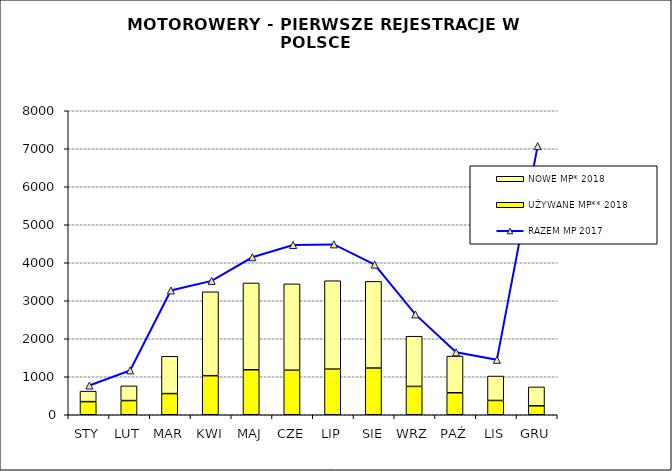
| Category | UŻYWANE MP** 2018 | NOWE MP* 2018 |
|---|---|---|
| STY | 345 | 277 |
| LUT | 373 | 387 |
| MAR | 557 | 982 |
| KWI | 1028 | 2208 |
| MAJ | 1184 | 2285 |
| CZE | 1172 | 2273 |
| LIP | 1200 | 2327 |
| SIE | 1229 | 2281 |
| WRZ | 746 | 1321 |
| PAŹ | 579 | 965 |
| LIS | 376 | 643 |
| GRU | 235 | 498 |